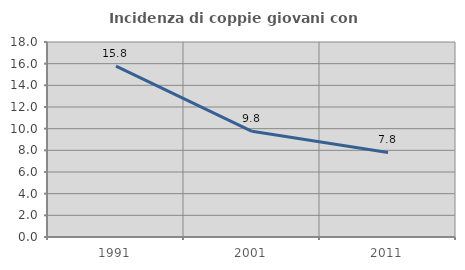
| Category | Incidenza di coppie giovani con figli |
|---|---|
| 1991.0 | 15.78 |
| 2001.0 | 9.756 |
| 2011.0 | 7.803 |